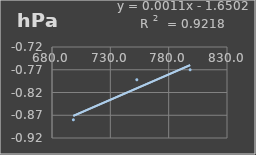
| Category | Presión Admosferica |
|---|---|
| 698.3 | -0.88 |
| 752.7 | -0.792 |
| 798.4 | -0.77 |